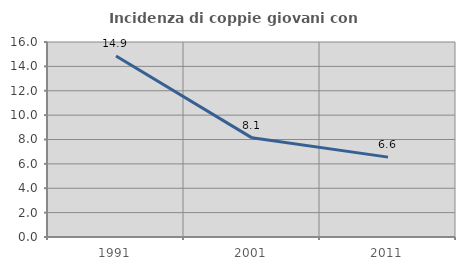
| Category | Incidenza di coppie giovani con figli |
|---|---|
| 1991.0 | 14.857 |
| 2001.0 | 8.136 |
| 2011.0 | 6.553 |